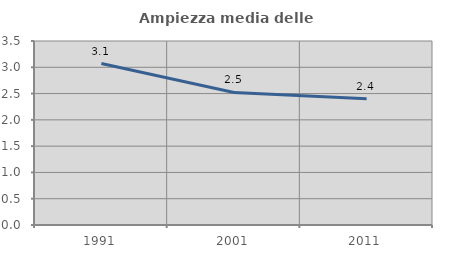
| Category | Ampiezza media delle famiglie |
|---|---|
| 1991.0 | 3.071 |
| 2001.0 | 2.522 |
| 2011.0 | 2.402 |